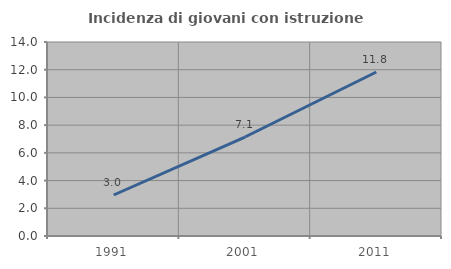
| Category | Incidenza di giovani con istruzione universitaria |
|---|---|
| 1991.0 | 2.959 |
| 2001.0 | 7.143 |
| 2011.0 | 11.834 |